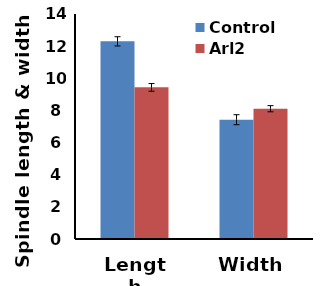
| Category | Control | Arl2 |
|---|---|---|
| Length | 12.298 | 9.435 |
| Width | 7.422 | 8.106 |